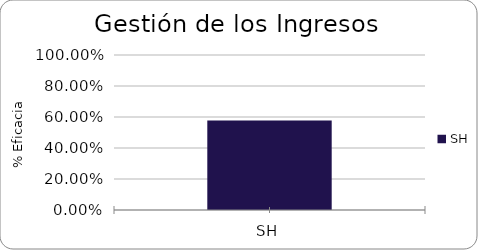
| Category | % Eficacia total |
|---|---|
| SH | 0.577 |